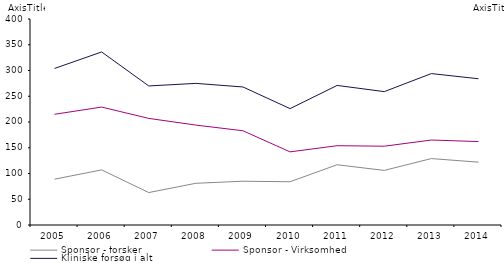
| Category | Sponsor - forsker | Sponsor - Virksomhed | Kliniske forsøg i alt  |
|---|---|---|---|
| 2005.0 | 89 | 215 | 304 |
| 2006.0 | 107 | 229 | 336 |
| 2007.0 | 63 | 207 | 270 |
| 2008.0 | 81 | 194 | 275 |
| 2009.0 | 85 | 183 | 268 |
| 2010.0 | 84 | 142 | 226 |
| 2011.0 | 117 | 154 | 271 |
| 2012.0 | 106 | 153 | 259 |
| 2013.0 | 129 | 165 | 294 |
| 2014.0 | 122 | 162 | 284 |